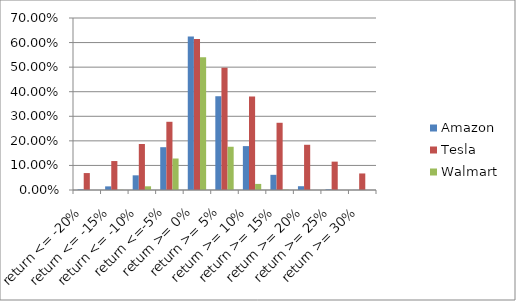
| Category | Amazon | Tesla | Walmart |
|---|---|---|---|
| return <= -20% | 0.003 | 0.069 | 0 |
| return <= -15% | 0.015 | 0.118 | 0.001 |
| return <= -10% | 0.06 | 0.187 | 0.015 |
| return <=-5% | 0.174 | 0.278 | 0.128 |
| return >= 0% | 0.625 | 0.615 | 0.541 |
| return >= 5% | 0.382 | 0.498 | 0.176 |
| return >= 10% | 0.179 | 0.381 | 0.025 |
| return >= 15% | 0.062 | 0.274 | 0.001 |
| return >= 20% | 0.015 | 0.184 | 0 |
| return >= 25% | 0.003 | 0.115 | 0 |
| return >= 30% | 0 | 0.067 | 0 |